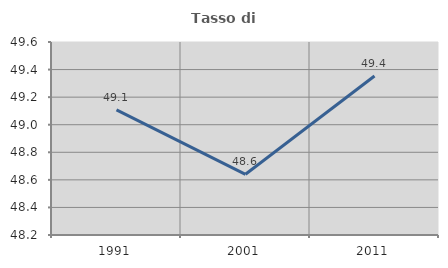
| Category | Tasso di occupazione   |
|---|---|
| 1991.0 | 49.107 |
| 2001.0 | 48.64 |
| 2011.0 | 49.354 |